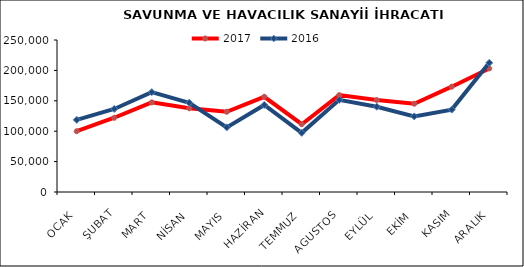
| Category | 2017 | 2016 |
|---|---|---|
| OCAK | 99964.754 | 118636.142 |
| ŞUBAT | 122114.311 | 136585.772 |
| MART | 147396.471 | 164167.688 |
| NİSAN | 137727.171 | 146799.343 |
| MAYIS | 131960.786 | 106338.515 |
| HAZİRAN | 156546.928 | 143121.239 |
| TEMMUZ | 111487.755 | 97285.007 |
| AGUSTOS | 159375.433 | 151570.553 |
| EYLÜL | 151239.852 | 140241.911 |
| EKİM | 145188.472 | 124349.494 |
| KASIM | 173205.135 | 135519.442 |
| ARALIK | 203245.642 | 212501.04 |